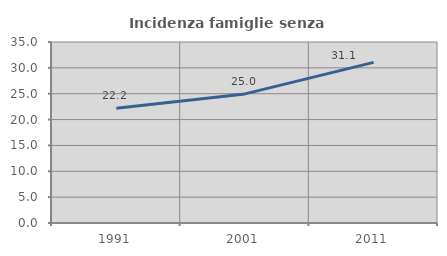
| Category | Incidenza famiglie senza nuclei |
|---|---|
| 1991.0 | 22.174 |
| 2001.0 | 24.965 |
| 2011.0 | 31.057 |